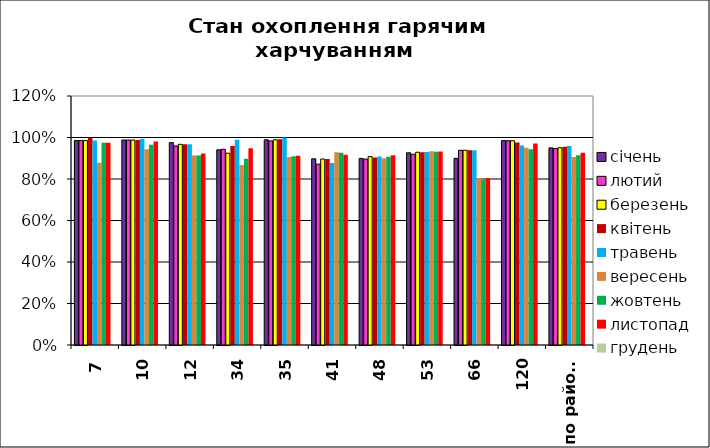
| Category | січень | лютий | березень | квітень | травень | вересень | жовтень | листопад | грудень |
|---|---|---|---|---|---|---|---|---|---|
| 7 | 0.985 | 0.985 | 0.985 | 1 | 0.985 | 0.878 | 0.974 | 0.975 | 0 |
| 10 | 0.988 | 0.988 | 0.988 | 0.988 | 0.994 | 0.943 | 0.965 | 0.981 | 0 |
| 12 | 0.975 | 0.959 | 0.967 | 0.967 | 0.967 | 0.913 | 0.913 | 0.923 | 0 |
| 34 | 0.941 | 0.943 | 0.924 | 0.959 | 0.989 | 0.867 | 0.897 | 0.949 | 0 |
| 35 | 0.989 | 0.984 | 0.989 | 0.992 | 1 | 0.906 | 0.91 | 0.912 | 0 |
| 41 | 0.897 | 0.872 | 0.896 | 0.896 | 0.877 | 0.929 | 0.926 | 0.917 | 0 |
| 48 | 0.899 | 0.896 | 0.908 | 0.904 | 0.908 | 0.9 | 0.907 | 0.914 | 0 |
| 53 | 0.926 | 0.919 | 0.929 | 0.929 | 0.93 | 0.934 | 0.931 | 0.933 | 0 |
| 66 | 0.9 | 0.939 | 0.939 | 0.939 | 0.939 | 0.805 | 0.795 | 0.805 | 0 |
| 120 | 0.985 | 0.984 | 0.984 | 0.976 | 0.961 | 0.951 | 0.944 | 0.971 | 0 |
| по району | 0.95 | 0.947 | 0.951 | 0.955 | 0.959 | 0.906 | 0.915 | 0.927 | 0 |